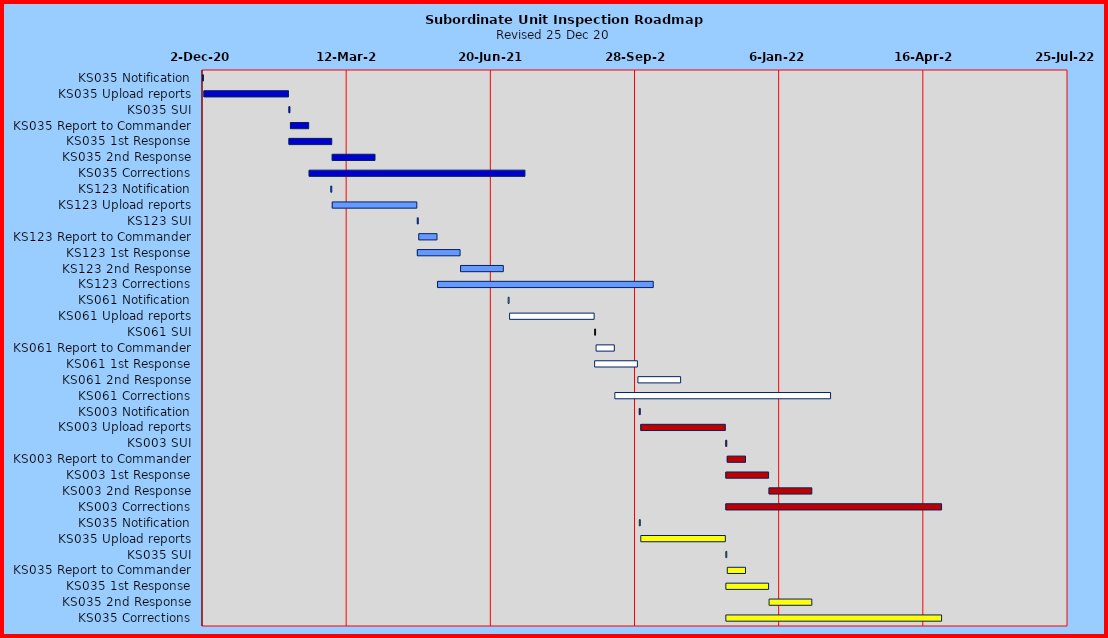
| Category | Start | Duration |
|---|---|---|
| KS035 Notification | 2020-12-02 | 1 |
| KS035 Upload reports | 2020-12-03 | 59 |
| KS035 SUI | 2021-01-31 | 1 |
| KS035 Report to Commander | 2021-02-01 | 13 |
| KS035 1st Response | 2021-01-31 | 30 |
| KS035 2nd Response | 2021-03-02 | 30 |
| KS035 Corrections | 2021-02-14 | 150 |
| KS123 Notification | 2021-03-01 | 1 |
| KS123 Upload reports | 2021-03-02 | 59 |
| KS123 SUI | 2021-04-30 | 1 |
| KS123 Report to Commander | 2021-05-01 | 13 |
| KS123 1st Response | 2021-04-30 | 30 |
| KS123 2nd Response | 2021-05-30 | 30 |
| KS123 Corrections | 2021-05-14 | 150 |
| KS061 Notification | 2021-07-02 | 1 |
| KS061 Upload reports | 2021-07-03 | 59 |
| KS061 SUI | 2021-08-31 | 1 |
| KS061 Report to Commander | 2021-09-01 | 13 |
| KS061 1st Response | 2021-08-31 | 30 |
| KS061 2nd Response | 2021-09-30 | 30 |
| KS061 Corrections | 2021-09-14 | 150 |
| KS003 Notification | 2021-10-01 | 1 |
| KS003 Upload reports | 2021-10-02 | 59 |
| KS003 SUI | 2021-11-30 | 1 |
| KS003 Report to Commander | 2021-12-01 | 13 |
| KS003 1st Response | 2021-11-30 | 30 |
| KS003 2nd Response | 2021-12-30 | 30 |
| KS003 Corrections | 2021-11-30 | 150 |
| KS035 Notification | 2021-10-01 | 1 |
| KS035 Upload reports | 2021-10-02 | 59 |
| KS035 SUI | 2021-11-30 | 1 |
| KS035 Report to Commander | 2021-12-01 | 13 |
| KS035 1st Response | 2021-11-30 | 30 |
| KS035 2nd Response | 2021-12-30 | 30 |
| KS035 Corrections | 2021-11-30 | 150 |